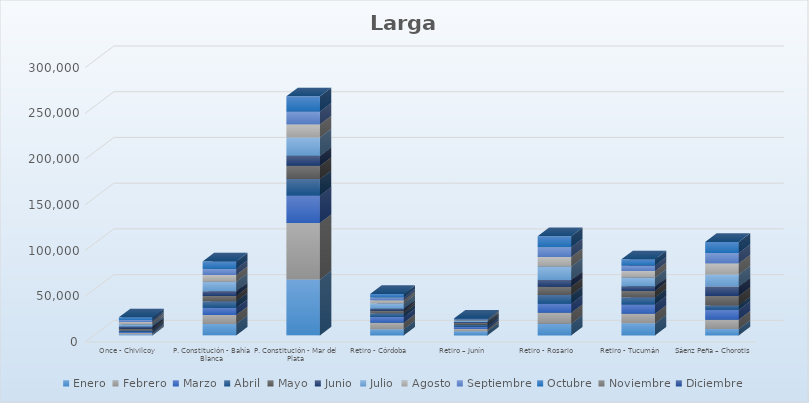
| Category | Enero | Febrero | Marzo | Abril | Mayo | Junio | Julio | Agosto | Septiembre | Octubre | Noviembre | Diciembre |
|---|---|---|---|---|---|---|---|---|---|---|---|---|
| Once - Chivilcoy | 1366 | 1322 | 1405 | 1444 | 1941 | 2107 | 2769 | 2539 | 2090 | 2841 |  |  |
| P. Constitución - Bahía Blanca | 12708 | 9664 | 7951 | 7031 | 5937 | 5080 | 10492 | 7283 | 6820 | 8007 |  |  |
| P. Constitución - Mar del Plata | 61339 | 61671 | 30072 | 18014 | 14431 | 10941 | 20166 | 14229 | 14071 | 16625 |  |  |
| Retiro - Córdoba | 6952 | 6924 | 6217 | 4121 | 2721 | 2227 | 6074 | 3303 | 3127 | 3667 |  |  |
| Retiro – Junín | 4700 | 2288 | 2582 | 2293 | 1921 | 894 | 1725 | 906 | 499 | 702 |  |  |
| Retiro - Rosario | 12831 | 11922 | 9976 | 9616 | 8988 | 7410 | 14621 | 10487 | 10792 | 11998 |  |  |
| Retiro - Tucumán | 13292 | 10398 | 10211 | 7923 | 7208 | 4512 | 9813 | 7097 | 6029 | 6808 |  |  |
| Sáenz Peña – Chorotis | 7058 | 10252 | 10848 | 4695 | 10234 | 10545 | 13088 | 12073 | 11478 | 11999 |  |  |